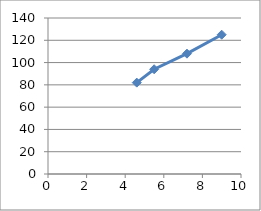
| Category | Series 0 |
|---|---|
| 4.6 | 82 |
| 5.5 | 94 |
| 7.2 | 108 |
| 9.0 | 125 |